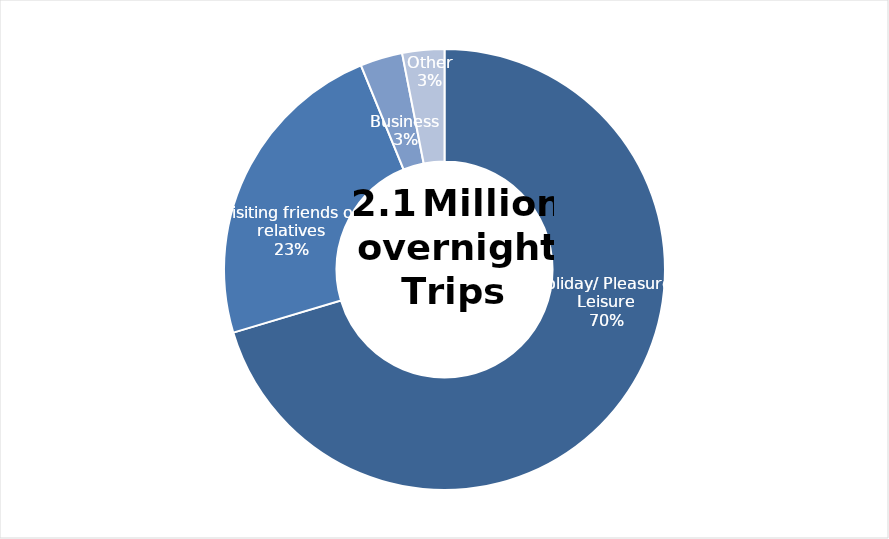
| Category | Series 0 |
|---|---|
| Holiday/ Pleasure/ Leisure | 1458405 |
| Visiting friends or relatives | 485698 |
| Business | 64255 |
| Other | 63842 |